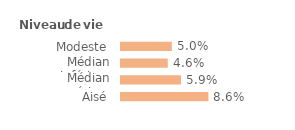
| Category | Series 0 |
|---|---|
| Modeste | 0.05 |
| Médian inférieur | 0.046 |
| Médian supérieur | 0.059 |
| Aisé | 0.086 |